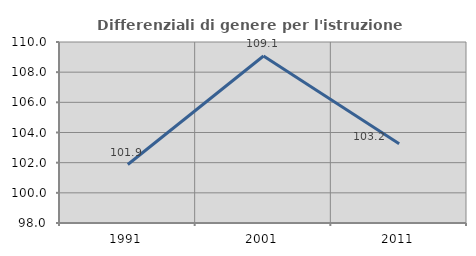
| Category | Differenziali di genere per l'istruzione superiore |
|---|---|
| 1991.0 | 101.876 |
| 2001.0 | 109.074 |
| 2011.0 | 103.247 |